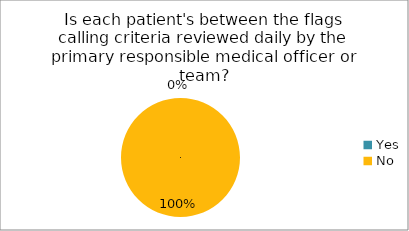
| Category | Is each patient's between the flags calling criteria reviewed daily by the primary responsible medical officer or team? | Is each patient's escalation of care plan reviewed daily by the primary responsible medical officer or team? | Is each patient's between the flags calling criteria reviewed by the primary responsible medical officer or team prior to transfer to the ward? | Is each patient's escalation of care plan reviewed  by the primary responsible medical officer or team prior to transfer to the ward? | Is each patient's management plans documented daily by the admitting medical officer? | Is medical handover documented at transfer of care using a formalised process? | Is nursing handover documented at transfer of care using a formalised process? |
|---|---|---|---|---|---|---|---|
| Yes | 0 | 0 | 0 | 0.1 | 0 | 0 | 0 |
| No | 1 | 1 | 1 | 1 | 1 | 1 | 1 |